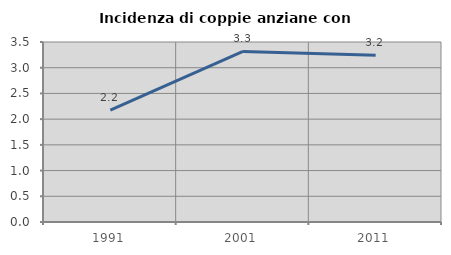
| Category | Incidenza di coppie anziane con figli |
|---|---|
| 1991.0 | 2.175 |
| 2001.0 | 3.316 |
| 2011.0 | 3.242 |